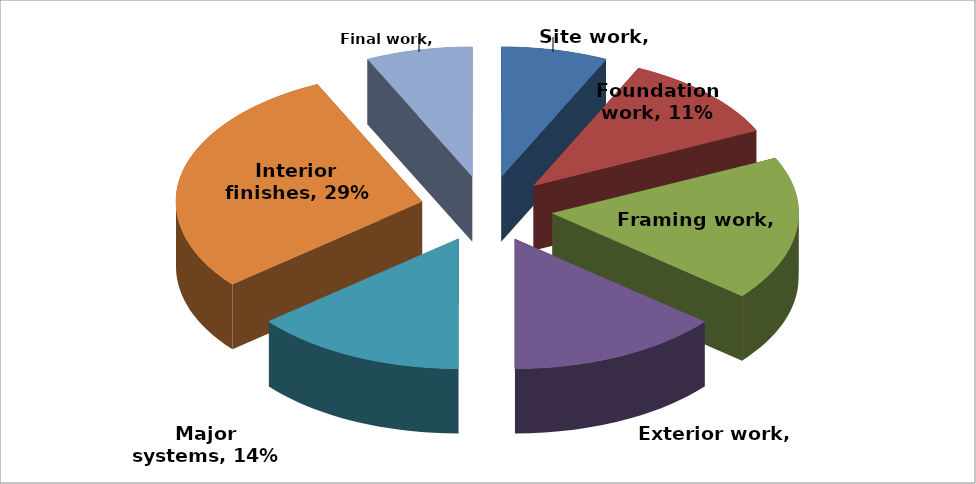
| Category | Series 0 | Series 1 |
|---|---|---|
| Site work | 0.07 | 32774 |
| Foundation work | 0.11 | 51502 |
| Framing work | 0.18 | 84276 |
| Exterior work | 0.14 | 65548 |
| Major systems | 0.14 | 65548 |
| Interior finishes | 0.29 | 135778 |
| Final work | 0.07 | 32774 |